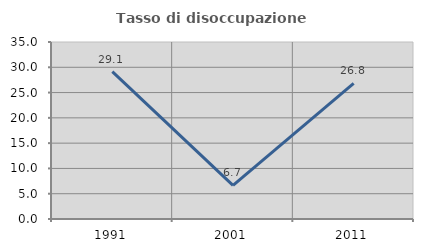
| Category | Tasso di disoccupazione giovanile  |
|---|---|
| 1991.0 | 29.143 |
| 2001.0 | 6.667 |
| 2011.0 | 26.829 |